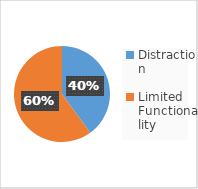
| Category | Series 0 |
|---|---|
| Distraction | 4 |
| Limited Functionality | 6 |